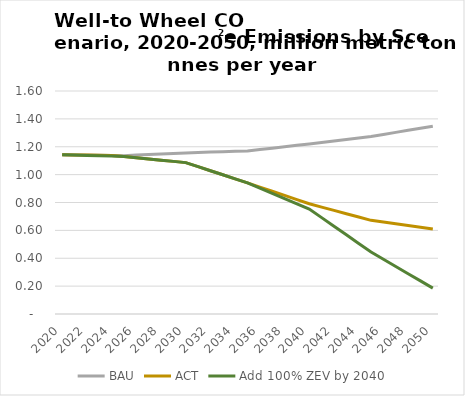
| Category | BAU | ACT | Add 100% ZEV by 2040 |
|---|---|---|---|
| 2020.0 | 1.143 | 1.143 | 1.143 |
| 2021.0 | 1.141 | 1.141 | 1.14 |
| 2022.0 | 1.14 | 1.14 | 1.138 |
| 2023.0 | 1.139 | 1.139 | 1.135 |
| 2024.0 | 1.137 | 1.137 | 1.133 |
| 2025.0 | 1.136 | 1.13 | 1.13 |
| 2026.0 | 1.14 | 1.122 | 1.122 |
| 2027.0 | 1.144 | 1.113 | 1.113 |
| 2028.0 | 1.148 | 1.104 | 1.104 |
| 2029.0 | 1.152 | 1.095 | 1.095 |
| 2030.0 | 1.156 | 1.086 | 1.086 |
| 2031.0 | 1.159 | 1.057 | 1.057 |
| 2032.0 | 1.161 | 1.028 | 1.028 |
| 2033.0 | 1.164 | 0.999 | 0.999 |
| 2034.0 | 1.167 | 0.97 | 0.97 |
| 2035.0 | 1.17 | 0.941 | 0.941 |
| 2036.0 | 1.18 | 0.911 | 0.903 |
| 2037.0 | 1.19 | 0.881 | 0.866 |
| 2038.0 | 1.2 | 0.851 | 0.828 |
| 2039.0 | 1.21 | 0.821 | 0.791 |
| 2040.0 | 1.22 | 0.791 | 0.753 |
| 2041.0 | 1.231 | 0.767 | 0.691 |
| 2042.0 | 1.241 | 0.743 | 0.63 |
| 2043.0 | 1.252 | 0.72 | 0.568 |
| 2044.0 | 1.263 | 0.696 | 0.506 |
| 2045.0 | 1.273 | 0.672 | 0.444 |
| 2046.0 | 1.288 | 0.659 | 0.393 |
| 2047.0 | 1.303 | 0.647 | 0.341 |
| 2048.0 | 1.318 | 0.634 | 0.289 |
| 2049.0 | 1.333 | 0.622 | 0.237 |
| 2050.0 | 1.348 | 0.61 | 0.186 |